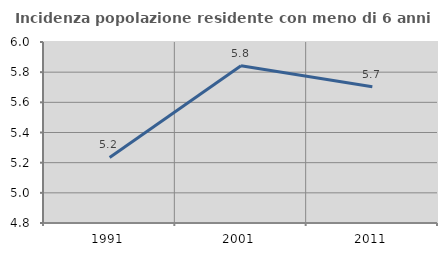
| Category | Incidenza popolazione residente con meno di 6 anni |
|---|---|
| 1991.0 | 5.235 |
| 2001.0 | 5.842 |
| 2011.0 | 5.703 |